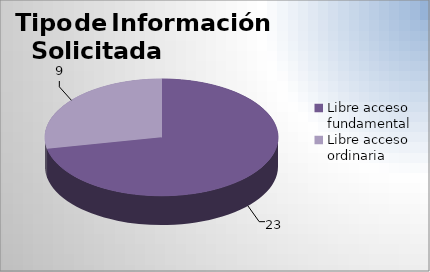
| Category | Series 0 |
|---|---|
| Libre acceso fundamental | 23 |
| Libre acceso ordinaria  | 9 |